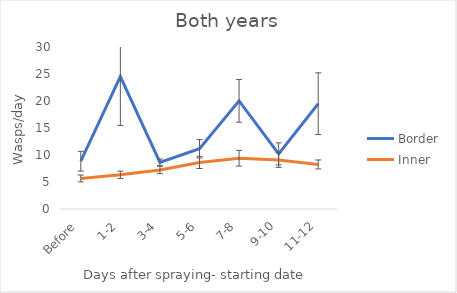
| Category | Border | Inner |
|---|---|---|
| Before | 8.85 | 5.654 |
| 1-2 | 24.518 | 6.33 |
| 3-4 | 8.643 | 7.238 |
| 5-6 | 11.153 | 8.623 |
| 7-8 | 20.031 | 9.406 |
| 9-10 | 10.208 | 9.069 |
| 11-12 | 19.5 | 8.25 |